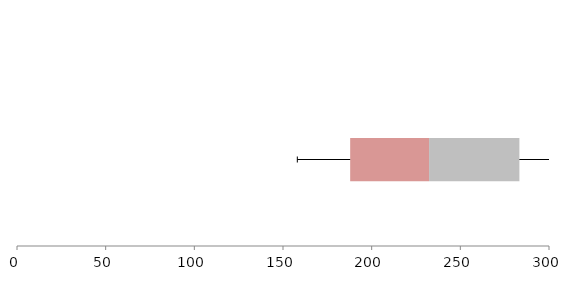
| Category | Series 1 | Series 2 | Series 3 |
|---|---|---|---|
| 0 | 187.881 | 44.487 | 50.941 |